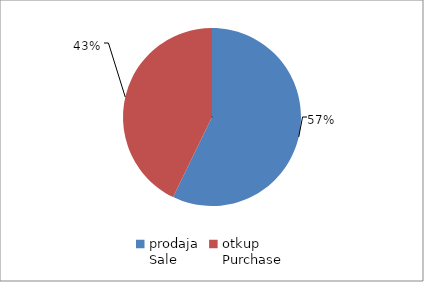
| Category | Series 0 |
|---|---|
| prodaja
Sale | 11621312 |
| otkup
Purchase | 8698174.8 |